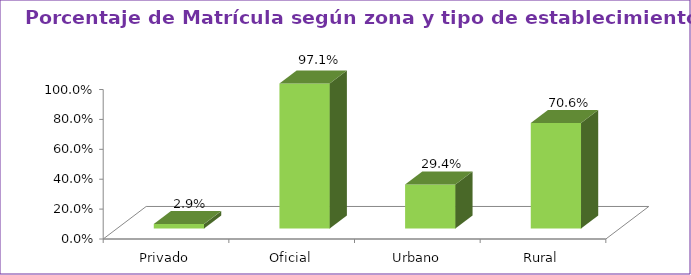
| Category | Series 1 |
|---|---|
| Privado | 0.029 |
| Oficial | 0.971 |
| Urbano | 0.294 |
| Rural | 0.706 |